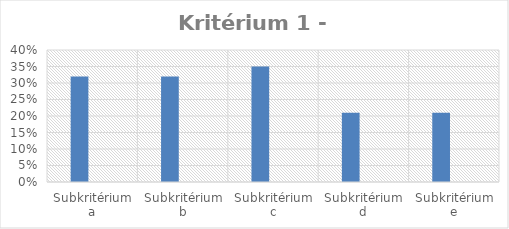
| Category | Series 0 | Series 1 |
|---|---|---|
| Subkritérium a | 0.32 |  |
| Subkritérium b | 0.32 |  |
| Subkritérium c | 0.35 |  |
| Subkritérium d | 0.21 |  |
| Subkritérium e | 0.21 |  |